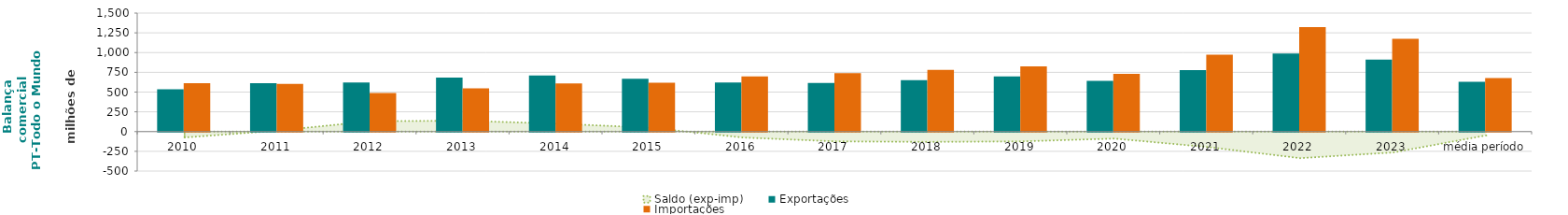
| Category | Exportações  | Importações  |
|---|---|---|
| 2010 | 536.738 | 611.548 |
| 2011 | 613.894 | 602.41 |
| 2012 | 620.129 | 489.185 |
| 2013 | 684.013 | 546.474 |
| 2014 | 710.992 | 610.843 |
| 2015 | 668.539 | 618.596 |
| 2016 | 622.408 | 697.11 |
| 2017 | 614.052 | 738.356 |
| 2018 | 649.784 | 780.705 |
| 2019 | 699.595 | 824.089 |
| 2020 | 642.485 | 731.129 |
| 2021 | 777.045 | 972.072 |
| 2022 | 987.569 | 1323.916 |
| 2023 | 909.894 | 1174.404 |
| média período | 628.914 | 677.383 |